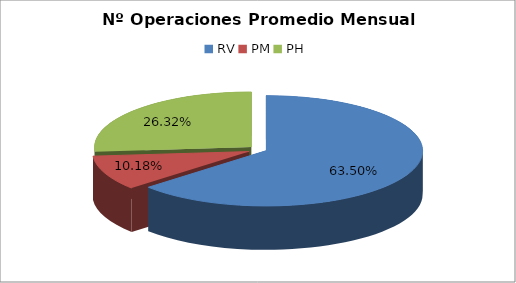
| Category | Series 0 |
|---|---|
| RV | 21043 |
| PM | 3372 |
| PH | 8722.833 |